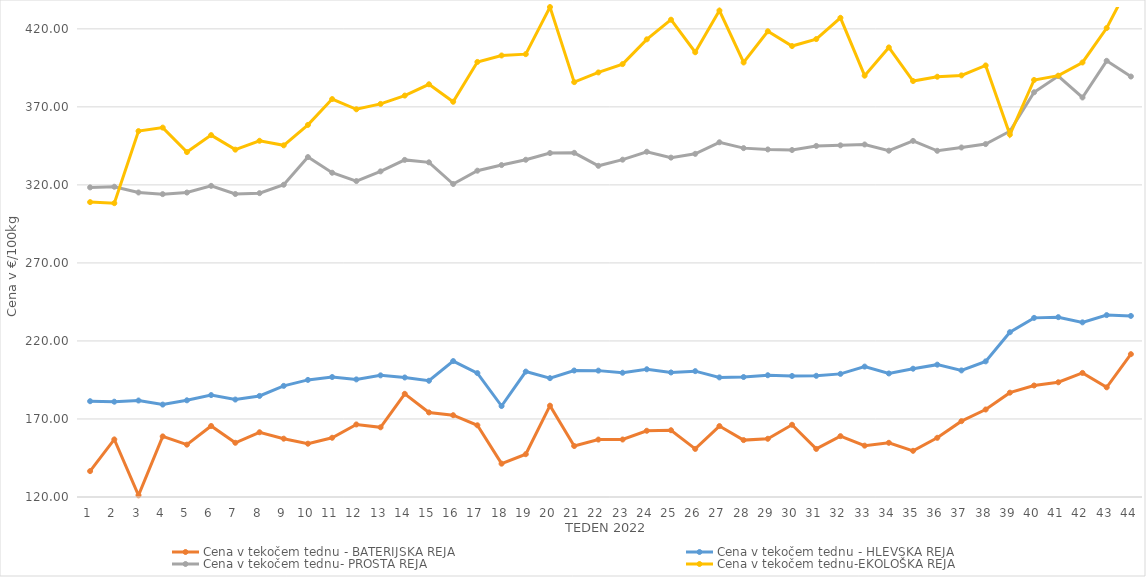
| Category | Cena v tekočem tednu - BATERIJSKA REJA | Cena v tekočem tednu - HLEVSKA REJA | Cena v tekočem tednu- PROSTA REJA | Cena v tekočem tednu-EKOLOŠKA REJA |
|---|---|---|---|---|
| 1.0 | 136.59 | 181.38 | 318.4 | 308.97 |
| 2.0 | 156.88 | 181.07 | 318.82 | 308.28 |
| 3.0 | 121.07 | 181.83 | 315.14 | 354.48 |
| 4.0 | 158.82 | 179.22 | 314.08 | 356.72 |
| 5.0 | 153.55 | 181.96 | 315.1 | 341.03 |
| 6.0 | 165.51 | 185.31 | 319.38 | 351.9 |
| 7.0 | 154.74 | 182.45 | 314.16 | 342.59 |
| 8.0 | 161.48 | 184.77 | 314.71 | 348.28 |
| 9.0 | 157.38 | 191.21 | 320.1 | 345.35 |
| 10.0 | 154.16 | 195.04 | 337.83 | 358.45 |
| 11.0 | 157.96 | 196.88 | 327.79 | 375 |
| 12.0 | 166.49 | 195.36 | 322.46 | 368.45 |
| 13.0 | 164.66 | 197.95 | 328.67 | 371.9 |
| 14.0 | 186.11 | 196.59 | 336.02 | 377.24 |
| 15.0 | 174.18 | 194.49 | 334.46 | 384.48 |
| 16.0 | 172.42 | 207.1 | 320.58 | 373.28 |
| 17.0 | 165.96 | 199.41 | 329.11 | 398.79 |
| 18.0 | 141.36 | 178.29 | 332.71 | 402.93 |
| 19.0 | 147.43 | 200.37 | 336.11 | 403.79 |
| 20.0 | 178.51 | 196.16 | 340.4 | 433.97 |
| 21.0 | 152.67 | 201.05 | 340.55 | 385.86 |
| 22.0 | 156.8 | 200.98 | 332.23 | 392.07 |
| 23.0 | 156.84 | 199.63 | 336.16 | 397.41 |
| 24.0 | 162.44 | 201.86 | 341.24 | 413.28 |
| 25.0 | 162.78 | 199.81 | 337.48 | 425.86 |
| 26.0 | 150.82 | 200.65 | 339.9 | 405 |
| 27.0 | 165.45 | 196.64 | 347.3 | 431.72 |
| 28.0 | 156.46 | 196.88 | 343.56 | 398.45 |
| 29.0 | 157.31 | 198.03 | 342.71 | 418.45 |
| 30.0 | 166.29 | 197.55 | 342.35 | 408.97 |
| 31.0 | 150.81 | 197.66 | 344.97 | 413.45 |
| 32.0 | 158.99 | 198.9 | 345.35 | 427.07 |
| 33.0 | 152.91 | 203.57 | 345.9 | 390 |
| 34.0 | 154.73 | 199.17 | 341.92 | 408.1 |
| 35.0 | 149.6 | 202.21 | 348.2 | 386.55 |
| 36.0 | 157.93 | 204.81 | 341.85 | 389.31 |
| 37.0 | 168.61 | 201.11 | 343.97 | 390.17 |
| 38.0 | 176.07 | 206.91 | 346.16 | 396.55 |
| 39.0 | 186.86 | 225.6 | 354.41 | 352.24 |
| 40.0 | 191.45 | 234.79 | 379.35 | 387.24 |
| 41.0 | 193.52 | 235.24 | 389.75 | 390 |
| 42.0 | 199.51 | 231.92 | 376.02 | 398.45 |
| 43.0 | 190.28 | 236.56 | 399.51 | 420.52 |
| 44.0 | 211.53 | 236.04 | 389.44 | 450.35 |